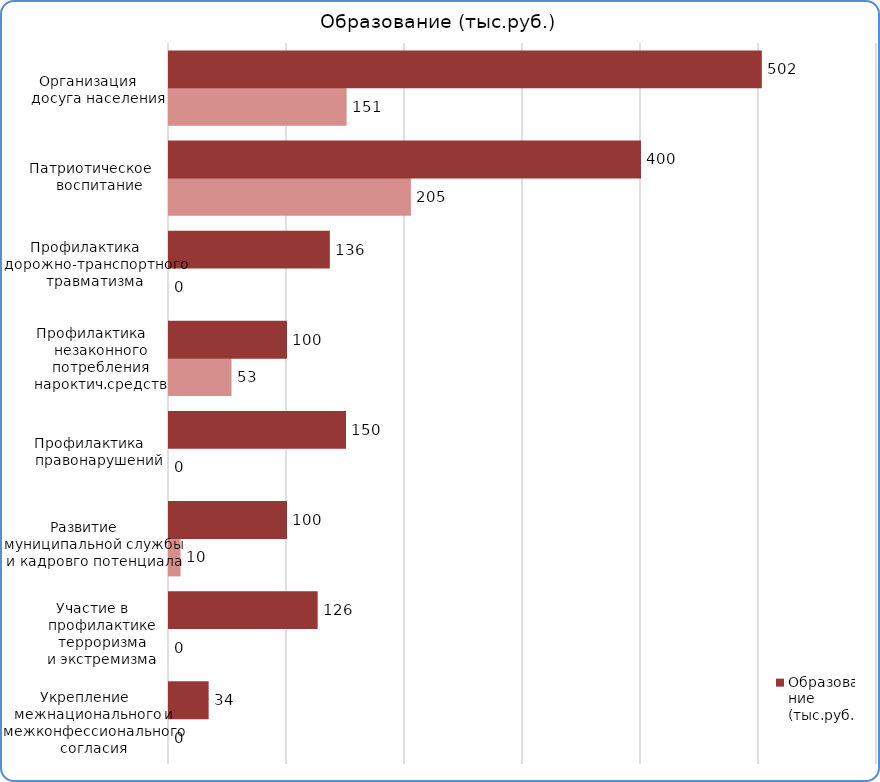
| Category | Факт | План  |
|---|---|---|
| Укрепление межнационального и межконфессионального согласия | 0 | 33600 |
| Участие в профилактике терроризма и экстремизма | 0 | 126000 |
| Развитие и совершенствование муниципальной службы и кадрового потенциала МО | 9800 | 100000 |
| Профилактика правонарушений | 0 | 150000 |
| Профилактика незаконного потребления наркотических и психотропных веществ | 53000 | 100000 |
| Профилактика дорожно-транспортного травматизма | 0 | 136300 |
| Патриотическое воспитание | 205000 | 400000 |
| Организация досуга населения | 150500 | 502400 |